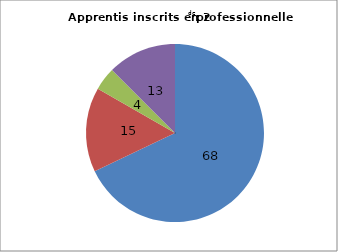
| Category | Bac Pro |
|---|---|
| Au moins un vœu en apprentissage | 67.907 |
| Au moins un vœu en voie professionnelle scolaire (et pas de vœu en apprentissage) | 15.394 |
| Aucun vœu en voie professionnelle (et pas de vœu en apprentissage) | 4.185 |
| Aucun vœu sur la plateforme Affelnet | 12.513 |